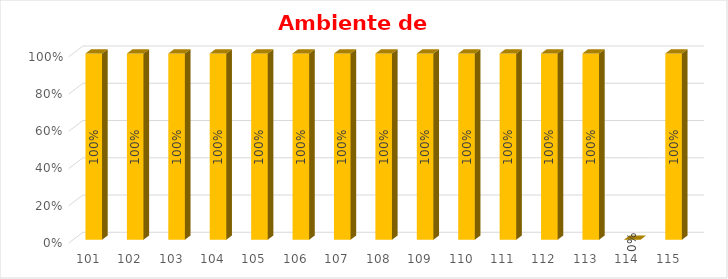
| Category | % Avance |
|---|---|
| 101.0 | 1 |
| 102.0 | 1 |
| 103.0 | 1 |
| 104.0 | 1 |
| 105.0 | 1 |
| 106.0 | 1 |
| 107.0 | 1 |
| 108.0 | 1 |
| 109.0 | 1 |
| 110.0 | 1 |
| 111.0 | 1 |
| 112.0 | 1 |
| 113.0 | 1 |
| 114.0 | 0 |
| 115.0 | 1 |